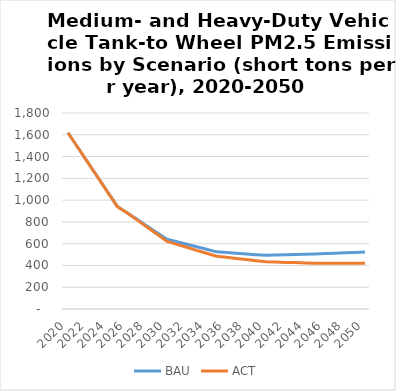
| Category | BAU | ACT |
|---|---|---|
| 2020.0 | 1619 | 1619 |
| 2021.0 | 1483 | 1483 |
| 2022.0 | 1348 | 1347 |
| 2023.0 | 1212 | 1210 |
| 2024.0 | 1077 | 1074 |
| 2025.0 | 941 | 938 |
| 2026.0 | 881 | 881 |
| 2027.0 | 821 | 816 |
| 2028.0 | 761 | 751 |
| 2029.0 | 701 | 686 |
| 2030.0 | 641 | 621 |
| 2031.0 | 618 | 594 |
| 2032.0 | 595 | 567 |
| 2033.0 | 571 | 539 |
| 2034.0 | 548 | 512 |
| 2035.0 | 525 | 485 |
| 2036.0 | 519 | 475 |
| 2037.0 | 512 | 464 |
| 2038.0 | 506 | 454 |
| 2039.0 | 499 | 443 |
| 2040.0 | 493 | 433 |
| 2041.0 | 495 | 431 |
| 2042.0 | 498 | 428 |
| 2043.0 | 500 | 426 |
| 2044.0 | 503 | 423 |
| 2045.0 | 505 | 421 |
| 2046.0 | 509 | 421 |
| 2047.0 | 513 | 421 |
| 2048.0 | 516 | 421 |
| 2049.0 | 520 | 421 |
| 2050.0 | 524 | 421 |